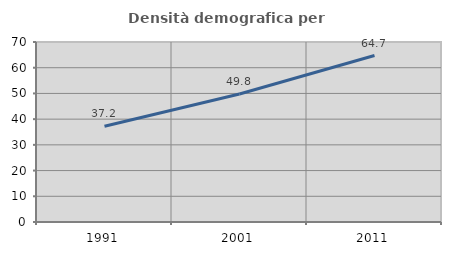
| Category | Densità demografica |
|---|---|
| 1991.0 | 37.207 |
| 2001.0 | 49.763 |
| 2011.0 | 64.738 |